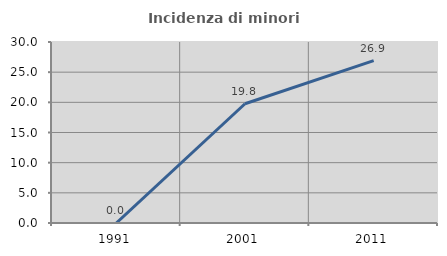
| Category | Incidenza di minori stranieri |
|---|---|
| 1991.0 | 0 |
| 2001.0 | 19.767 |
| 2011.0 | 26.914 |